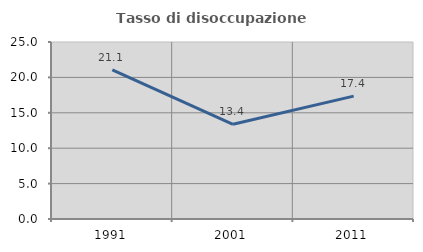
| Category | Tasso di disoccupazione giovanile  |
|---|---|
| 1991.0 | 21.053 |
| 2001.0 | 13.38 |
| 2011.0 | 17.355 |